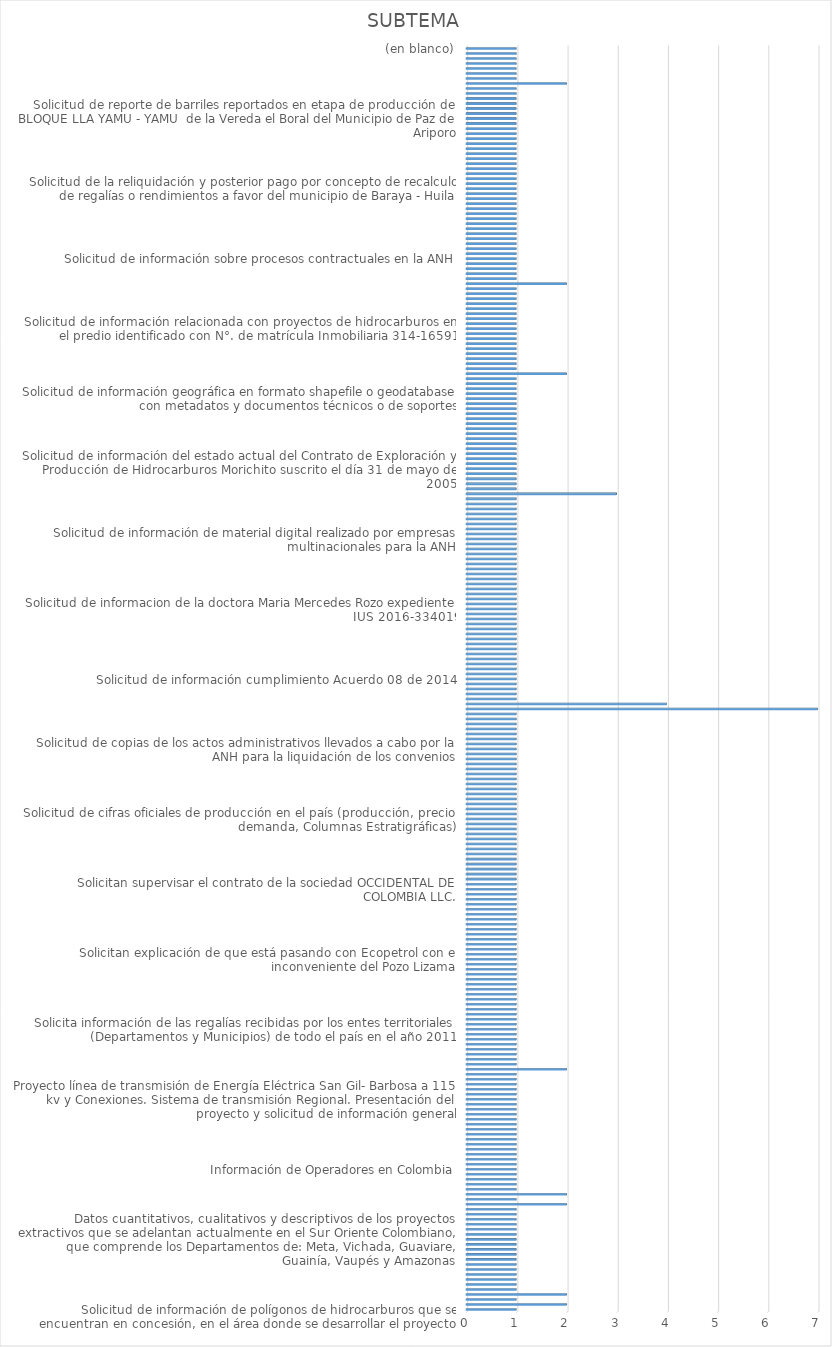
| Category | CANTIDAD |
|---|---|
| 
Solicitud de información de polígonos de hidrocarburos que se encuentran en concesión, en el área donde se desarrollar el proyecto
 | 1 |
| Acompañamiento a comunidad en desarrollo de proyecto (ambiental, social) | 2 |
| Actividad Hidrocarburífera en regiones del país | 1 |
| Áreas Asignadas, Áreas libres, reglamentación especial, requisitos y criterios para su asignación | 2 |
| Bloque Cubarral discriminadas por año desde 2005 hasta el 2017 | 1 |
| Bonos de entrada exploración, explotación o producción que haya pagado la compañía por el uso del bloque Cubarral, discriminados anualmente desde el año 2005 hasta el 2017  | 1 |
| Coadyuvancia denuncia posible afectación ambiental | 1 |
| Coadyuvancia denuncia posible afectación ambiental -  Defensoría del Pueblo Regional Magdalena Medio | 1 |
| Comunicación de la Sociedad Naves S.A.S. relacionada con el suministro de combustible en el área de fondeo de la Bahía de Santa Marta y presuntos incumplimientos de la regla Marpol 14.4 anexo VI | 1 |
| Comunicación decreto calamidad pública, afloramiento de crudo Pozo Lizama 158 Barrancabermeja | 1 |
| Comunicación proceso de compra predio Cauca y solicitud de información | 1 |
| Contrato de Exploracion y Produccion de Hidrocarburos - Bloque Llanos 34 | 1 |
| Contrato de exploración y producción de hidrocarburos N°029 – La Pola. (Contrato E&P La Pola) | 1 |
| Contrato N° 016 del 2006 celebrado entre la ANH y el consorcio denominado CANAGUARO, integrado por las empresas DISICO S.A., LINEA VIVA INGENIEROS S.A. y CLEANENERGY LTDA  | 1 |
| Datos cuantitativos, cualitativos y descriptivos de los proyectos extractivos que se adelantan actualmente en el Sur Oriente Colombiano, que comprende los Departamentos de: Meta, Vichada, Guaviare, Guainía, Vaupés y Amazonas | 1 |
| Denuncia de incumplimiento contractual por parte de Interoil Colombia Exploration and Production para con Colombian Energy Services, empresa proveedora de los equipos y pruebas de Well testing para los pozos vikingo 1 y turaco 1, pertenecientes a los bloqu | 1 |
| Denuncia de los incumplimientos a las leyes y licencias ambientales por parte de la operadora las Quinchas y Pacific en los bloques Mauritia y Cravo Viejo | 1 |
| Documentos de las historias laborales de la ANH con el señor Eric Mauricio Vargas Forero para el proceso ante el juzgado 30 de familia, en la reducción de cuota de alimentos de una menor | 1 |
| Efectuar la reliquidacion y posterior pago por concepto de recalculo de regalias o rendimientos a favor del Municipio de San Jose del Fragua - Caqueta | 1 |
| El señor Cesar González informa que pueden utilizar cualquier área o total del predio para explorar las proyecciones de sensibilizar en la fuentes, puntos o coordenadas claves para su respectivo estudio en hidrocarburos | 1 |
| Estado del bloque Cebucan en los llanos orientales | 1 |
| Estudios geofísicos y de sísmica | 2 |
| Inconformidad por desarrollo irregular de proyecto | 1 |
| Inconformidad por la exclusión de la inversión social otorgada a las personas residentes en la Vereda Puerto Miryam | 2 |
| Inconformismo con la empresa CNE OIL & GAS, CANACOL ENERGY, por violación a los derechos de inclusión e imparcialidad | 1 |
| Informa anomalía en el combustible de la estación de servicio Texaco Sierra Nevada ubicada en la calle 30 N° 60-252 Mamatoco | 1 |
| Información de bloques petroleros | 1 |
| Información de la producción total anual del bloque Cubarral discriminado año a año desde el 2005 hasta el 2017 | 1 |
| Información de Operadores en Colombia | 1 |
| Información del riesgo de la construcción de la línea de flujo en los Hurones cerca de la vivienda del señor Luis Ferney Tojuelo en Nunchia | 1 |
| Información sobre bloques o áreas de exploración en los predios con N° de matrícula inmobiliaria 015-17564, 015-78782 y 015-1399 del municipio de Taraza Antioquia | 1 |
| Información y aclaración procesos contractuales, términos de referencia, plazos, pólizas | 1 |
| Informe actualizado de la producción por cada campo de producción de los municipios de Puerto Gaitán | 1 |
| Intervención para que operador vincule personal | 1 |
| Intervención por no pago a subcontratistas por parte de Operadoras  | 1 |
| Inversión social el tigre Municipio de San Luis de Palenque | 1 |
| La Junta de Acción Comunal Planas envían actas donde viene solicitando el proyecto desde hace mucho tiempo y donde se ha socializado en la comunidad | 1 |
| Manifiesta a la ANH que Las juntas comunales: Carimagua I y Carimagua II no tienen territorios son ilegales; y eso lo deben conocer las operadoras como NEW GRANADA ENERGY, Anteriormente PLUSPETROL; Para evitar ilegales; actuaciones y entrega de beneficios; | 1 |
| Participación Comisión Municipal de Derechos Humanos de Puerto Gaitán | 1 |
| Presentación de inconformación por la excusión de la inversion social otorgada a las personas residentes en la vereda Puerto Miryam  | 1 |
| Proceso disciplinario PD-6087-17 | 1 |
| Proceso Ejecutivo Gaia Consultores Ambientales S.A.S. contra Green Power | 1 |
| Proyecto línea de transmisión de Energía Eléctrica San Gil- Barbosa a 115 kv y Conexiones. Sistema de transmisión Regional. Presentación del proyecto y solicitud de información general | 1 |
| Realización de actividades no autorizadas en el canal Ospina Perez por el Consorcio VSM 2017 | 1 |
| Remiten comunicación emitida por la Empresa Frontera Energy, en donde se desconoce la convocatoria realziada por la Defensoria del Pueblo | 1 |
| Remiten el Plan de Acción construido por el CMGRD para la emergencia de la Lizama  | 1 |
| Requerimiento presupuestal y contable de informacion en el fenecimiento de la cuenta general del presupuesto y del tesoro y balance general de la nacion vigencia fiscal 2017 | 1 |
| Requiere el estado actual de los bloques de Cauca-7 Monserrate Azar COL 4 COL 5 COL 6 COL 8 CHO OFF 5 CHO OFF 6 COR 65 COR 66 COR 46 COR 8 COR 54 COR 49 COR 9 COR 64 COR 47 COR 42 COR 8 CPO 8 CPO 11 CPO 10 Fuerte Norte | 1 |
| Respuesta a los requerimientos exigidos en el AUTO ANLA 989 de 2017 que se efectuaron del seguimiento y control ambiental | 2 |
| Respuesta a propuesta desarrollo territorial Bloque Rancho Hermoso  | 1 |
| Solcitud de certificado del señor Juan Carlos Gonzalez Pardo  | 1 |
| Solcitud de informacion tecnica Aplicación ControlDoc ANH - plan de continuidad de Negocios  | 1 |
| Solicita a Frontera Energy Corporation (FEC), que en el marco de las competencias y obligaciones, proporcionen la informacion  | 1 |
| Solicita a la ANH  si el contrato N°371 de 2017 a la fecha se encuentra liquidado  | 1 |
| Solicita a qué personas y por medio de qué documento fueron reconocidas y autorizadas para reclamar las regalías en la sucesión del señor Julián Llinas Rodríguez | 1 |
| Solicita el avance de la actividad de exploración y explotación del gas metano en depósitos de carbón en Colombia | 1 |
| Solicita información de las regalías recibidas por los entes territoriales (Departamentos y Municipios) de todo el país en el año 2011 | 1 |
| Solicita que se incluya dentro de la inversión social voluntaria aportada por la empresa New Granada Energy Corporation correspondiente a los años 2014 y 2015 | 1 |
| Solicita realziar visita o inspeccion en la juridiccion del Municipio de Aguachica como en otros Municipios de la region, donde se lleva o se llevara a cabo la practica del Fracking para la extraccion de pretroleo y no concedan permiso para extraer hidroca | 1 |
| Solicita tener en cuenta que la entidad Pacific Process Systems Engneering no le ha cancelado salarios pendientes al señor Fredy Guerrero Pintor | 1 |
| Solicita un delegado de la ANH con el fin de que se tomen las medidas necesarias y urgentes para solucionar la afectación a los predios denominados el Potrero y el Amarillal | 1 |
| Solicitan a la ANH colaborar para que la entidad Nikoil realice el pago de la deuda que tiene con la Empresa Transporte Caribe | 1 |
| Solicitan a la ANH intervención en el contrato Macro de Geopark | 1 |
| Solicitan a la ANH la informacion de produccion de aceite y agua del año 2017 y del primer trimestre del año 2018, correspondiente a todos los campos petroleros de Colombia, discriminado por compañía y ccampo, con el respectivo sistema de levantamiento | 1 |
| Solicitan aclaración con las referencias de las categorías incremental, pesado y básica en el rubro tipo de producción | 1 |
| Solicitan colaboracion a las autoridades para que no se violen y ni se vulneren los derechos a los desempleados de la vereda Puerto Trujillo de Puerto Gaitan Meta  | 1 |
| Solicitan dar cumplimiento a lo dispuesto en el numeral 3 del artículo 16 de la ley 1755 del 30 de Junio de 2015 | 1 |
| Solicitan establecer a que campos pertenecía el área devuelta por Ecopetrol a la ANH en el acta N° 1 de devolución de áreas del convenio de explotación de hidrocarburos  | 1 |
| Solicitan explicación de la producción fiscalizada de los campos Castilla Este y Castilla Norte, registrada en la ANH para los años 2013 y 2014 | 1 |
| Solicitan explicacion de los convenios y contratos existentes con la empresa Ecopetrol  | 1 |
| Solicitan explicación de que está pasando con Ecopetrol con el inconveniente del Pozo Lizama | 1 |
| Solicitan explicar por qué la producción fiscalizada de los campos Castilla Este y Castilla Norte, registrada en la ANH, para los años 2013 y 2014 aparecen adscritos al contrato Castilla y Apiay respectivamente | 1 |
| Solicitan información de los recursos de regalías girados al Municipio de Ortega Tolima desde el año 2004 al 2011 | 1 |
| Solicitan que certifiquen la fecha de perforación y el estado actual de los Pozos y/o locaciones | 1 |
| Solicitan que la Operadora Hocol ubicado en la vereda la Cristalina del Municipio de Puerto Gaitan, socialice el plan de inversion social de 2018  | 1 |
| Solicitan que no se concedan permiso para extraer hidrocarburos del Municipio de Aguachica con la modalidad de FRACKING | 1 |
| Solicitan que se brinde la rendición de cuentas del servicio público de empleo de la superintendencia de servicios públicos y de la contratista COFREM en el Municipio de Puerto Gaitán | 1 |
| Solicitan que se incluya unas personas en el programa de inversion social  | 1 |
| Solicitan que se incluyan a Angélica, Camila, Diana, Martha, Pedro, Alejandra, Jhonatany Jeymi en el programa de inversión social | 1 |
| Solicitan que se investiguen la modificacion de Licencias Ambientales Campo Rubiales | 1 |
| Solicitan que se ordene a la sociedad INTEROIL COLOMBIA EXPLORATION & PRODUCCION, de cumplimiento al contrato de concesión, específicamente el art. 51,2 | 1 |
| Solicitan que se realice la verificacion si efectivamente la empresa Gran Tierra Energy esta o ono dando cumplimiento a la legislacion nacional  vigente en lo que respeta a los perfiles profesionales del personal que tiene como responsable de las actividad | 1 |
| Solicitan que se realicen las gestiones pertinentes y se dé garantía efectiva a los derechos y bienestar integral de nuestra sociedad | 1 |
| Solicitan se verifique la aplicación del decreto 1668 del 21 octubre de 2016 | 1 |
| Solicitan supervisar el contrato de la sociedad OCCIDENTAL DE COLOMBIA LLC. | 1 |
| Solicitud calamidad publica afloramiento de crudo Pozo Lizama 158   - Barrancabermeja | 1 |
| Solicitud conformación comité técnico de inspección a operaciones realizadas en nuestro territorio y mesa de concertacón e interpretación sobre Decreto 1668 de 2016 | 1 |
| Solicitud copia expediente 003 | 1 |
| Solicitud copias de paz y salvos  | 1 |
| Solicitud de acompañamiento a comunidad en desarrollo de proyecto (ambiental, social) | 1 |
| Solicitud de acompañamiento ciudadano por el conflicto social por selección de beneficiarios de inversión social | 1 |
| Solicitud de áreas de explotación ubicados en el Municipio de Agua de Dios (Cundinamarca), bajo que modalidad o contrato están asignadas, y la plena identificación o información de los predios afectados | 1 |
| Solicitud de areas de explotación ubicados en el Municipio de Agua de Dios (Cundinamarca), bajo que modalidad o contrato estan asignadas, y la plena identificacion o informacion de los predios afectados  | 1 |
| Solicitud de atención urgente en zona de frontera del municipio Jurado – Chocó con panamá  | 1 |
| Solicitud de base de datos de ingresos de regalías antes de la reforma que dio origen al SGR | 1 |
| Solicitud de certificación de la actividad comercial que realiza la Empresa GEO PRODUCTIONS OIL AND GAS COMPANY en el Municipio de Pueblo Nuevo Córdoba | 1 |
| Solicitud de certificación del saldo de los recursos retenidos, así como sus rendimientos financieros correspondientes al municipio de Arauca | 1 |
| Solicitud de certificado de experiencia correspondiente al contrato N° 443 de 2017 celebrados UT SUMNET 2017 y la ANH  | 1 |
| Solicitud de cifras oficiales de producción en el país (producción, precio, demanda, Columnas Estratigráficas) | 1 |
| Solicitud de conceptos técnicos  | 1 |
| Solicitud de confirmación de contratos adicionales vigentes para yacimientos no convencionales y listado de compañías con las que la ANH tiene contratos adicionales para yacimientos no convencionales | 1 |
| Solicitud de Contrato de Exploración y produción de Hidrocarburos Morichito, suscrito el 31 de mayo de 2005 entre la ANH y Petropuli Ltda  | 1 |
| Solicitud de contratos de exploración, explotación y producción de hidrocarburos asignados en el área de estudio dentro jurisdicción de Corpoboyaca del Municipio de Tunja | 1 |
| Solicitud de contratos de exploración, explotación y producción de hidrocarburos asignados en el área de estudio dentro jurisdicción de Corpoboyaca en los Municipios de Aquitania, Mongua Mongui y Sogamoso | 1 |
| Solicitud de contratos de exploración, explotación y producción de hidrocarburos asignados en el área de estudio dentro jurisdicción de Corpoboyaca en los Municipios de Belen, Tutaza, Cerinza y Santa Rosa de Viterbo | 1 |
| Solicitud de copia de comunicaciones  | 1 |
| Solicitud de copia de la respuesta impartida al a Superintendencia de Puertos y Transportes, relacionada con la Estación de Servicios sin permiso de uso de la vía tramo Barbosa – Pradera Km0 + 450 SN | 1 |
| Solicitud de copia de los contratos celebrados por la ANH desde 2010 hasta hoy con la sociedad GPC DRILLING SAS | 1 |
| Solicitud de copia del convenio de explotación firmado entre Ecopetrol S.A. y la ANH a la terminación del contrato de Asociación Huila y copia de sus correspondientes anexos y modificaciones | 1 |
| Solicitud de copias de contratos con anexos y adiciones o modificaciones que la ANH ha suscrito con INTEROIL COLOMBIA EXPLORATION AND PRODUCCIÓN | 1 |
| Solicitud de copias de las actas del Comité de Contratos de Hidrocarburos desde el año 2007 hasta la fecha  | 1 |
| Solicitud de copias de las pólizas de seguros del contrato N° 292 de 2015 | 1 |
| Solicitud de copias de los actos administrativos llevados a cabo por la ANH para la liquidación de los convenios | 1 |
| Solicitud de copias de los contratos celebrados y convenios de exploración y explotación de hidrocarburos en el departamento de Caquetá y copia de las asignaciones para exploración y/o explotación con sujeción a las modalidades y tipos de contratación exis | 1 |
| Solicitud de definiciones de las características pesadas y extra pesadas del crudo colombiano, este es penalizado; establecer cuáles son las penalidades que se deben asumir por las características pesadas y extra pesadas del crudo colombiano | 1 |
| Solicitud de documentos contractuales y/o modificaciones suscritas entre las partes correspondientes a los contratos de evaluación técnicas | 1 |
| Solicitud de documentos del convenio de explotación de hidrocarburos otorgado por la ANH a Ecopetrol | 1 |
| Solicitud de enviar comisión de funcionarios expertos para que realicen la exploración correspondiente y determine si existe o no un yacimiento petrolero en el predio ubicado en la ribera del rio Suruco del corregimiento de Campo Bonito | 1 |
| Solicitud de generalidades del campo Cohembi (localización, descripción de columnas, generalidades de la cementación, definición y clasificación) | 1 |
| Solicitud de inforacion de barriles reportados en etapa de produccion del BLOQUE LLA YAMU - YAMU de la Vereda el Boral del Municipio de Paz de Ariporo | 1 |
| Solicitud de información | 7 |
| Solicitud de información  | 4 |
| Solicitud de información acerca de los operadores o contratistas que exploraron los campos en los municipios de Arauca y Arauquita entre los años 2014 y 2017 | 1 |
| Solicitud de información básica de la cuenta del Catatumbo | 1 |
| Solicitud de información con la ejecución del contrato N°292 de 2015 | 1 |
| Solicitud de información correspondiente a polígonos de hidrocarburos que se encuentren en concesión | 1 |
| Solicitud de información cumplimiento Acuerdo 08 de 2014 | 1 |
| Solicitud de informacion de actividad de hidrocarburos en Colombia | 1 |
| Solicitud de información de análisis y caracterización de rocas tipo SHALE usando la física digital de rocas | 1 |
| Solicitud de información de áreas de explotación ubicados en el Municipio de Agua de Dios (Cundinamarca) | 1 |
| Solicitud de información de áreas del polígono ubicado en el mar Caribe al Norte de la Península de la Guajira se encuentran libres en materia de actividades de hidrocarburos | 1 |
| Solicitud de información de avisos de descubrimiento de petróleo y gas presentados por año desde 1988 hasta 2016 en Colombia | 1 |
| Solicitud de información de bonos de entrada de exploración o explotación y derechos económicos que se hayan pagado en el marco del convenio de explotación Cubarral desde el año 2005 hasta el 2017 | 1 |
| Solicitud de información de campos y calidad | 1 |
| Solicitud de información de Colombia Energy de incumplimientos | 1 |
| Solicitud de información de comunicaciones del señor Eduardo Del Valle Mora | 1 |
| Solicitud de información de comunicaciones, informes mensuales y pólizas | 1 |
| Solicitud de información de contratos | 1 |
| Solicitud de informacion de Convenios de Asociacion y de Exploracion y Explotacion de Hidrocarburos entre ANH y Ecopetrol S.A. | 1 |
| Solicitud de información de la aplicación de regalías variables en proyectos de producción Incremental | 1 |
| Solicitud de informacion de la doctora Maria Mercedes Rozo expediente IUS 2016-334019 | 1 |
| Solicitud de información de la empresa que realiza los estudios de suelo en la vereda Siripiana del Municipio de Cumariboen el departamento del Vichada | 1 |
| Solicitud de información de la fiscalización | 1 |
| Solicitud de información de la propuesta para el mejoramiento de desarrollo territorial para las veredas Caño Seco, Mata Negra, Quebrada - Seca, Surimena y Mariara. | 1 |
| Solicitud de información de la prórroga solicita del señor Miguel Medina para aceptar el cargo y el procedimiento en caso de que el señor no se presente o no acepte el cargo, dado que la Sra. Claudia Rodríguez seria la que sigue para suplir el cargo | 1 |
| Solicitud de información de las direcciones que tiene registradas el sr. Héctor Galindo como funcionario y exfuncionario | 1 |
| Solicitud de información de las regalías de todos los departamentos y Municipios de Colombia en el año 2011 | 1 |
| Solicitud de informacion de los Bloques de hidrocarburos del Departamento de Cundinamarca  | 1 |
| Solicitud de informacion de los campos de produccion en Colombia | 1 |
| Solicitud de información de los contratos de E&P de hidrocarburos convencionales e hidrocarburos no convencionales | 1 |
| Solicitud de información de los montos de las inversiones del programa en beneficios de las comunidades por operador, Municipio y año desde el año 2001 | 1 |
| Solicitud de información de los Pozos declarados como no comerciales | 1 |
| Solicitud de información de los Shapefile o coordenadas de los polígonos de los bloques petroleros en el departamento del Caquetá | 1 |
| Solicitud de información de mapa de tierras, puntos de pozos y líneas de ductos | 1 |
| Solicitud de información de material digital realizado por empresas multinacionales para la ANH | 1 |
| Solicitud de información de métodos de producción para los campos: Valdivia y Rio Zulia de Iberoamericana, Santo Domingo de Vetra, Rancho Hermoso y Llanos 23 de Canacol, Platanillo de Amerisur, Casimena y CPE6 de Fronteras, Cabiona de New Granada y Corrale | 1 |
| Solicitud de información de políticas, planes y acciones que en el sector minero energético se han adelantado en el Municipio de Mocoa, Departamento de Putumayo | 1 |
| Solicitud de información de regalías derivadas de la producción de hidrocarburos líquidos y gaseosos | 1 |
| Solicitud de información de sedes u oficinas en el departamento de Boyacá  | 1 |
| Solicitud de información de todos los contratos mineros y explotación de hidrocarburos celebrados en la jurisdicción de la C.D.M.B. durante el periodo 2007 - 2017 | 1 |
| Solicitud de información de todos los contratos mineros, y de explotación de hidrocarburos celebrados en la jurisdicción de la C.D.M.B. durante el periodo 2007 - 2017 | 1 |
| Solicitud de información de un pozo ubicado en un predio rural denominado Las Coralinas | 1 |
| Solicitud de informacion del  volumen de produccion de crudo del Campo Ocelote Guarrojo y cual ha sidio su comportamiento de produccion en los ultimos 4 años  | 1 |
| Solicitud de información del bloque de Cubarral | 3 |
| Solicitud de información del Campo Casabe | 1 |
| Solicitud de información del contrato celebrado entre la ANH y DCX S.A.S. | 1 |
| Solicitud de información del Contrato de exploración y producción denominado Nashira (121) | 1 |
| Solicitud de informacion del contrato N° 69-2013, suscrito entre la Sucursal Colombia, con ocasión del Convenio FND - ANH 01 de 2017 | 1 |
| Solicitud de información del estado actual del Contrato de Exploración y Producción de Hidrocarburos Morichito suscrito el día 31 de mayo de 2005 | 1 |
| Solicitud de información del otorgamiento y vigencia de las licencias de exploración, evaluación y explotación de hidrocarburos otorgados a la empresa Petromont Colombia S.A. | 1 |
| Solicitud de información del recaudo, liquidación y transferencia de las regalías y compensaciones monetarias a favor de la Nación por la explotación de hidrocarburos (petróleo y gas) por empresa y pozos del año 2017 | 1 |
| Solicitud de información detallada de cuáles fueron las razones técnicas del Pozo Lizama | 1 |
| Solicitud de información detallada de la inversión social realizadas para la comunidad de Puerto Gaitán – Meta en los años 2014 - 2018 | 1 |
| Solicitud de información disponible con el mayor nivel de desagregación para la serie 2015 - 2017 para los recursos petróleo y gas natural | 1 |
| Solicitud de información disponible de gas natural, petróleo con la mayor desagregación para la serie 2015 - 2017 | 1 |
| Solicitud de información documental o por medio magnético copia del contrato en toda su extensión, celebrado entre la ANH y el consorcio – VIM 2017 | 1 |
| Solicitud de informacion documental y cartografica para la elaboracion del programa de Compensacion por Aprovechamiento Forestal | 1 |
| Solicitud de información en virtud de la SU 377 de 2014 y auto 664 de 2017  | 1 |
| Solicitud de información estaciones de servicio automotriz | 1 |
| Solicitud de información existente relacionada con el proyecto Nueva Malla Vial del Valle del Cauca | 1 |
| Solicitud de información frente al cumplimiento e implementación del Decreto 1668 y la ley 1551 del año 2015 | 1 |
| Solicitud de información geográfica actualizada de la capa shapefile que contiene los pozos de hidrocarburos de Colombia | 1 |
| Solicitud de información geográfica en formato shapefile o geodatabase con metadatos y documentos técnicos o de soportes | 1 |
| Solicitud de información Municipios SGR | 1 |
| Solicitud de información OPEC N°. 205092 | 1 |
| Solicitud de información para el proceso de diagnóstico y formulación del Plan de Ordenamiento Territorial del Municipio de Barrancabermeja | 1 |
| Solicitud de información para la actualizacion del plan Departamental de Gestion del Riesgo de Desastres | 1 |
| Solicitud de información para la revisión de las liquidaciones de regalías por la explotación de hidrocarburos de los campos productores en la jurisdicción del Departamento de Córdoba | 2 |
| Solicitud de información para llevar a cabo la revisión del EOT del Municipio Contratación Santander | 1 |
| Solicitud de información para llevar a cabo la revisión del EOT del municipio Guadalupe Santander  | 1 |
| Solicitud de información para los desempleados de la vereda Santa Helena del Municipio de Puerto Gaitán Meta | 1 |
| Solicitud de información presupuesto ejecutado en publicidad vigencias 2016 y 2017 | 1 |
| Solicitud de información proceso de negociación Carbones del Cerrejón Limited y Drummond Ltda sobre coexistencia de explotaciones Carbón y Gas Metano asociado al carbón. Proyecto Cerrejón Sur y Contrato Asociación Rio Ranchería | 1 |
| Solicitud de información referente al campo Acordionero, cuenca del VMM en el Cesar, datos referentes al inicio de explotación del campo, sus compañías operadoras, mapa, mecanismo de producción, generalidades e información de producción histórica y actual | 1 |
| Solicitud de información relacionada con directrices y orientaciones de buenas prácticas socio - ambientales, para el sector minero energético y de infraestructura, orientadas a reducir la deforestación | 1 |
| Solicitud de información relacionada con la producción y precios de los crudos explotados en los campos que se encuentran en jurisdicción del Municipio de Tauramena | 1 |
| Solicitud de información relacionada con proyectos de hidrocarburos en el predio identificado con N°. de matrícula Inmobiliaria 314-16591 | 1 |
| Solicitud de información relacionada con proyectos de hidrocarburos en los predios identificados con Nº de Matrículas Inmobiliarias 015-17564, 015-78782 y 015-1399 de la Oficina de Instrumentos Públicos de Caucasia – Antioquia | 1 |
| Solicitud de información relacionada con títulos mineros en Norte de Santander y Cesar | 1 |
| Solicitud de información si la ANH ha suscrito contratos con la sociedad comercial OMEGA NERGY COLOMBIA | 1 |
| Solicitud de información si la ANH tiene alguna norma que especifique lineamientos para la ubicación de plataformas de centro poblados o viviendas  | 1 |
| Solicitud de información sísmica y perforación exploratoria en la jurisdicción del Municipio de Maicao | 1 |
| Solicitud de información sobre aquellos eventos públicos que la ANH pretenda realizar o se encuentren organizando o patrocinando durante el año 2018 | 1 |
| Solicitud de información sobre conflictos mineros en el Territorio Nacional y conflictos ambientales en el Territorio Nacional | 1 |
| Solicitud de información sobre estudios adelantados desde el 2004 con relación a reservas probadas de petróleo | 1 |
| Solicitud de información sobre la infructuosidad de los pozos | 2 |
| Solicitud de información sobre la infructuosidad o no comercialidad de los pozos exploratorios | 1 |
| Solicitud de información sobre las áreas hidrocarburifico de la Nación en Jurisdicción del Municipio de San Luis de Gaceno Departamento de Boyacá | 1 |
| Solicitud de información sobre los procesos de convocatoria y selección de mano de obra calificada (MOC) y de mano de obra no calificada (MONC) para las actividades de Omega Energy y sus contratistas en el bloque y campo de desarrollo Buenavista | 1 |
| Solicitud de información sobre los proyectos a ejecutar en el territorio | 1 |
| Solicitud de información sobre procesos contractuales en la ANH | 1 |
| Solicitud de información sobre reportes de bloques y proyectos de explotación de hidrocarburos en los 20 Municipios focalizados por el MADR para la formulación del Plan de Ordenamiento Social de la Propiedad Rural POSPR | 1 |
| Solicitud de informacion tecnica pagina Web ANH - Plan de Continuidad de Negocios | 1 |
| Solicitud de informacion tecnica relacionada para la aplicación SSCH de ANH, en desarrollo de las actividades que hacen parte del contrato interadministrativo N°6 en la administracion consolidada de la estrategia de continuidad de negocio de la ANH 2017 -  | 1 |
| Solicitud de información y colaboración para la formulación de documento técnico de soporte de una Reserva Forestal Protectora Nacional | 1 |
| Solicitud de informe de Agencia Nacional de Tierras | 1 |
| Solicitud de informe en el que relacione los procesos de restitución de tierras  | 1 |
| Solicitud de inspección, divulgación ley 842 de 2003, Ley 20 de 1984 y solicitud de información  | 1 |
| Solicitud de intervención de la ANH, a través de la ETH (estrategia territorial para la gestión sostenible y equitativa del sector hidrocarburos), sobre problemática empresas habilitadas para transporte de carga en el municipio de Villanueva, Casanare | 1 |
| Solicitud de intervencion Proyecto Gobernanza del agua Vereda Caño Chiquito Municipio de Paz de Ariporo - Casanare | 1 |
| Solicitud de inventario y catastro de empresas dedicadas a la exploración y explotación de hidrocarburos en los 13 Municipios de la provincia de Sugamuxi en el Departamento de Boyacá | 1 |
| Solicitud de investigación administrativa y seguimiento al Plan de Manejo Ambiental de Ecopetrol S.A., por daño ambiental en el Municipio de Barrancabermeja | 1 |
| Solicitud de la base de datos de los ingresos de regalías (antes de la reforma que dio origen al Sistema General de Regalías – SGR)  | 1 |
| Solicitud de la producción de agua mensual del Campo Zopilote ubicado en el Bloque Cravoviejo Ena Cuenca de los llanos Orientales desde el año 2011 - 2017 | 1 |
| Solicitud de la reliquidación y posterior pago por concepto de recalculo de regalías o rendimientos a favor del municipio de Baraya - Huila | 1 |
| Solicitud de la reliquidación y posterior pago por concepto de recalculo de regalías o rendimientos a favor del municipio de Saravena - Arauca | 1 |
| Solicitud de la Resolución 0636 de junio del año 2015 que contiene la licencia Ambiental Global del Bloque de Desarrollo Llanos 58 (contrato E&P LLA-58) | 1 |
| Solicitud de las empresas, las cuales están autorizadas para la explotación de hidrocarburos en el Municipio de Maní Casanare, donde se identifique NIT, Razón Social y Tiempo que quedan exentos de toda clase de impuestos departamentales y municipales según | 1 |
| Solicitud de las liquidaciones definitivas de regalías de crudo desde el 1 de enero del año 2008 al 31 de diciembre de 2017 y copias de los contratos de Exploración y Explotación para los bloques Rio Verde y los Hatos | 1 |
| Solicitud de listado de empresas petroleras que se encuentran explorando hidrocarburos, con el ánimo de poderles ofrecer servicios petroleros | 1 |
| Solicitud de listado de oficiales de cumplimiento de la convención contra el cohecho internacional en todas las empresas operadoras, con actividades en la OrinoquiaColombia; Meta, Casanare y Putumayo | 1 |
| Solicitud de listado de proyectos de fracking en Colombia y en que Municipios se está adelantando | 1 |
| Solicitud de montos de regalías antes del año 2012, específicamente entre 2008 y 20011 | 1 |
| Solicitud de presencia de la ANH en una audiencia pública, conforme el art. 78 de la ley 1474 | 1 |
| Solicitud de producción fiscalizada del contrato Cubarral, así como de los campos que hacen parte del mismo | 1 |
| Solicitud de producción mensual de agua del Campo Zopilote ubicado en el Bloque Cravo Viejo en la cuenca en los llanos orientales de los años 2011 al 2017 | 1 |
| Solicitud de pruebas para que obren dentro del proceso de Responsabilidad Fiscal N° 001-2013-2015-01162 | 1 |
| Solicitud de reconocimiento de derecho económicos a favor del Municipio de Turamena | 1 |
| Solicitud de reporte de barriles reportados en etapa de producción del BLOQUE LLA YAMU - YAMU  de la Vereda el Boral del Municipio de Paz de Ariporo | 1 |
| Solicitud de resoluciones de liquidación y cobro de regalías de Crudo Gas para los distintos operadores y campos del país, desde el 1 de enero de 2013 y hasta la fecha de respuesta a esta comunicación | 1 |
| Solicitud de retención en la fuente, IVA y Ica practicados al 323 de fecha 09 de agosto de 2017 celebrado en el año 2017 | 1 |
| Solicitud de seguimiento y control a manaderos en Cimitarra | 1 |
| Solicitud de vía de ingreso al proyecto Yaguasito – Campo Jilguero. Expediente LAM 5350 ANLA | 1 |
| Solicitud del envió de la información requerida por el Departamento Nacional de Planeación y el Ministerio de Hacienda y Crédito Público, para la liquidación de excedentes financieros  | 1 |
| Solicitud del Plan de Acción Anticorrupción, de Atención al Ciudadano y del mapa de Riesgos de Corrupción | 1 |
| Solicitud dentro de la licencia ambiental 2211 de 2005 y 0984 de 2009 de LAM 3337, del bloque Rio Verde, operado por Colombia Energy Development  sucursal Colombia | 2 |
| Solicitud detalladamente de las áreas de los Calderos de Pesca en el Caribe y Pacifico colombiano | 1 |
| Solicitud formal de denunciar una mina de hidrocarburos en la reserva forestal de la sociedad civil el v/che, ubicada en las veredas el espinal y el alto de la Ocha del Municipio de Tesalia | 1 |
| Solicitud intervención problemática social bloque Rio Verde | 1 |
| Solicitud para dar a conocer el Plan de Acción Anticorrupción y de Atención al Ciudadano | 1 |
| Solicitud para saber en qué parte del sitio web se publica a información del cumplimiento a la Ley 1712 de 2014  | 1 |
| Solicitud y confirmación de la información de un proyecto de refinería privada | 1 |
| (en blanco) | 1 |